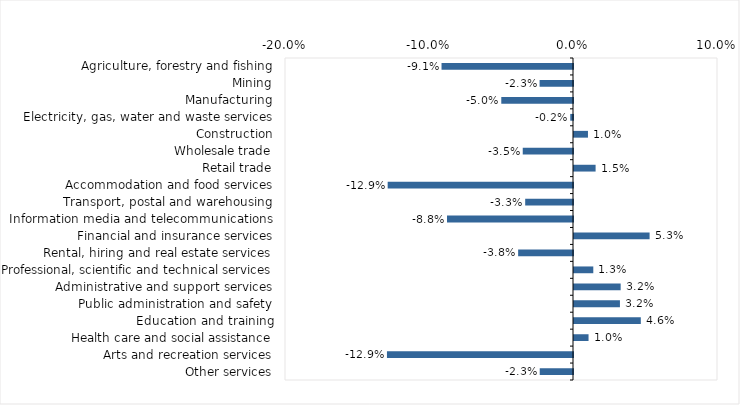
| Category | This week |
|---|---|
| Agriculture, forestry and fishing | -0.091 |
| Mining | -0.023 |
| Manufacturing | -0.05 |
| Electricity, gas, water and waste services | -0.002 |
| Construction | 0.01 |
| Wholesale trade | -0.035 |
| Retail trade | 0.015 |
| Accommodation and food services | -0.129 |
| Transport, postal and warehousing | -0.033 |
| Information media and telecommunications | -0.088 |
| Financial and insurance services | 0.052 |
| Rental, hiring and real estate services | -0.038 |
| Professional, scientific and technical services | 0.013 |
| Administrative and support services | 0.032 |
| Public administration and safety | 0.032 |
| Education and training | 0.046 |
| Health care and social assistance | 0.01 |
| Arts and recreation services | -0.129 |
| Other services | -0.023 |